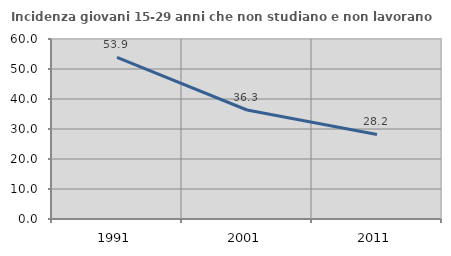
| Category | Incidenza giovani 15-29 anni che non studiano e non lavorano  |
|---|---|
| 1991.0 | 53.892 |
| 2001.0 | 36.333 |
| 2011.0 | 28.171 |